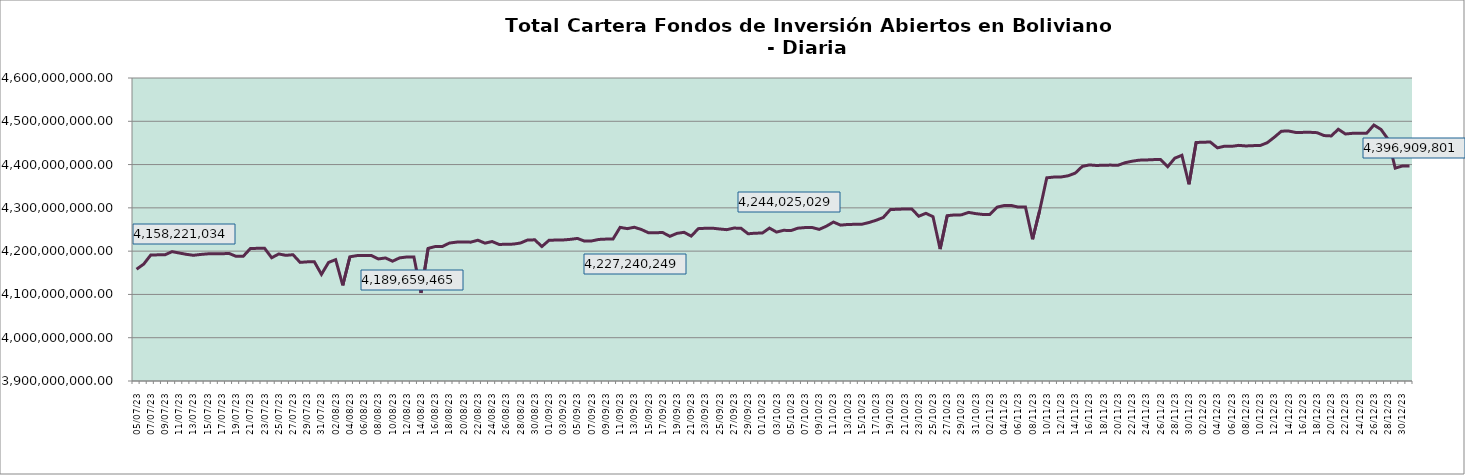
| Category | Cartera |
|---|---|
| 2023-07-05 | 4158221034.08 |
| 2023-07-06 | 4169974810.54 |
| 2023-07-07 | 4191063550.36 |
| 2023-07-08 | 4191428935.51 |
| 2023-07-09 | 4191586921.83 |
| 2023-07-10 | 4198901340.23 |
| 2023-07-11 | 4195687107.59 |
| 2023-07-12 | 4192644613.16 |
| 2023-07-13 | 4190400136.23 |
| 2023-07-14 | 4192336177.83 |
| 2023-07-15 | 4193705226.34 |
| 2023-07-16 | 4193877594.42 |
| 2023-07-17 | 4193884394.17 |
| 2023-07-18 | 4194821268.79 |
| 2023-07-19 | 4187948287.11 |
| 2023-07-20 | 4188026936.86 |
| 2023-07-21 | 4205930925.8 |
| 2023-07-22 | 4206534537.64 |
| 2023-07-23 | 4206693945.34 |
| 2023-07-24 | 4184753822.47 |
| 2023-07-25 | 4193497085.57 |
| 2023-07-26 | 4190287751.32 |
| 2023-07-27 | 4191772840.51 |
| 2023-07-28 | 4174048482 |
| 2023-07-29 | 4175243410.97 |
| 2023-07-30 | 4175403616.42 |
| 2023-07-31 | 4146339606.57 |
| 2023-08-01 | 4173947669.8 |
| 2023-08-02 | 4180302429.91 |
| 2023-08-03 | 4120964301.83 |
| 2023-08-04 | 4186896892.98 |
| 2023-08-05 | 4189659464.87 |
| 2023-08-06 | 4189829925.45 |
| 2023-08-07 | 4189997926.39 |
| 2023-08-08 | 4182013840.75 |
| 2023-08-09 | 4184244274.94 |
| 2023-08-10 | 4176804528.9 |
| 2023-08-11 | 4184479961.39 |
| 2023-08-12 | 4186483542.9 |
| 2023-08-13 | 4186665210.29 |
| 2023-08-14 | 4103514129.2 |
| 2023-08-15 | 4206353895.49 |
| 2023-08-16 | 4210672529.8 |
| 2023-08-17 | 4210754155.33 |
| 2023-08-18 | 4218713701.53 |
| 2023-08-19 | 4220833367.62 |
| 2023-08-20 | 4221001552.47 |
| 2023-08-21 | 4220802613.47 |
| 2023-08-22 | 4225243261.51 |
| 2023-08-23 | 4218450717.82 |
| 2023-08-24 | 4222200191.94 |
| 2023-08-25 | 4215374375.49 |
| 2023-08-26 | 4216013726.39 |
| 2023-08-27 | 4216249329.15 |
| 2023-08-28 | 4218832957.71 |
| 2023-08-29 | 4225826732.84 |
| 2023-08-30 | 4226083207.61 |
| 2023-08-31 | 4210660955.15 |
| 2023-09-01 | 4225037532.44 |
| 2023-09-02 | 4225665290.26 |
| 2023-09-03 | 4225837782.96 |
| 2023-09-04 | 4227240249.25 |
| 2023-09-05 | 4229369887.25 |
| 2023-09-06 | 4223134189.63 |
| 2023-09-07 | 4223572973.05 |
| 2023-09-08 | 4227031396.42 |
| 2023-09-09 | 4227828115.47 |
| 2023-09-10 | 4227998265.07 |
| 2023-09-11 | 4254934059.22 |
| 2023-09-12 | 4251997659.89 |
| 2023-09-13 | 4255168121.96 |
| 2023-09-14 | 4249945741.98 |
| 2023-09-15 | 4242376110.43 |
| 2023-09-16 | 4242697978.39 |
| 2023-09-17 | 4242873084.15 |
| 2023-09-18 | 4234198831.63 |
| 2023-09-19 | 4241122644.1 |
| 2023-09-20 | 4243478115.99 |
| 2023-09-21 | 4234723410.56 |
| 2023-09-22 | 4251990813.6 |
| 2023-09-23 | 4252824802.38 |
| 2023-09-24 | 4253001324.64 |
| 2023-09-25 | 4251195146.31 |
| 2023-09-26 | 4249614122.72 |
| 2023-09-27 | 4253275776.12 |
| 2023-09-28 | 4252923490.36 |
| 2023-09-29 | 4240084259.46 |
| 2023-09-30 | 4241550326.26 |
| 2023-10-01 | 4241740015.55 |
| 2023-10-02 | 4253251683.8 |
| 2023-10-03 | 4244025028.9 |
| 2023-10-04 | 4248160567.43 |
| 2023-10-05 | 4247416448.27 |
| 2023-10-06 | 4253046297.14 |
| 2023-10-07 | 4254432875.57 |
| 2023-10-08 | 4254607816.99 |
| 2023-10-09 | 4250276298.22 |
| 2023-10-10 | 4257566355.66 |
| 2023-10-11 | 4267208349.57 |
| 2023-10-12 | 4260077291.27 |
| 2023-10-13 | 4261575395.82 |
| 2023-10-14 | 4261984257.98 |
| 2023-10-15 | 4262148121.72 |
| 2023-10-16 | 4266161012.53 |
| 2023-10-17 | 4271338439.98 |
| 2023-10-18 | 4277700920.1 |
| 2023-10-19 | 4295989286.49 |
| 2023-10-20 | 4296752483 |
| 2023-10-21 | 4297352768.14 |
| 2023-10-22 | 4297515758.63 |
| 2023-10-23 | 4280664793.45 |
| 2023-10-24 | 4287408973.45 |
| 2023-10-25 | 4279614406.75 |
| 2023-10-26 | 4204785195.17 |
| 2023-10-27 | 4281961612.99 |
| 2023-10-28 | 4283622242.24 |
| 2023-10-29 | 4283803811.07 |
| 2023-10-30 | 4289506540.61 |
| 2023-10-31 | 4286689692.19 |
| 2023-11-01 | 4284761280.38 |
| 2023-11-02 | 4284889038.22 |
| 2023-11-03 | 4301594212.59 |
| 2023-11-04 | 4305374107 |
| 2023-11-05 | 4305557747.44 |
| 2023-11-06 | 4301691364.38 |
| 2023-11-07 | 4301975072.92 |
| 2023-11-08 | 4227421817.51 |
| 2023-11-09 | 4293799971.52 |
| 2023-11-10 | 4369428468.75 |
| 2023-11-11 | 4371160358 |
| 2023-11-12 | 4371321552.44 |
| 2023-11-13 | 4374036488.01 |
| 2023-11-14 | 4380249168.59 |
| 2023-11-15 | 4395825155.76 |
| 2023-11-16 | 4399190209.36 |
| 2023-11-17 | 4397887887.33 |
| 2023-11-18 | 4398579844.36 |
| 2023-11-19 | 4398759308.67 |
| 2023-11-20 | 4398296510.09 |
| 2023-11-21 | 4404236003.53 |
| 2023-11-22 | 4407786452.76 |
| 2023-11-23 | 4410199675.83 |
| 2023-11-24 | 4410645721.9 |
| 2023-11-25 | 4411427855.31 |
| 2023-11-26 | 4411608567.59 |
| 2023-11-27 | 4395009258.51 |
| 2023-11-28 | 4414758140.09 |
| 2023-11-29 | 4421448911.02 |
| 2023-11-30 | 4354375325.07 |
| 2023-12-01 | 4450921375.8 |
| 2023-12-02 | 4451765891.18 |
| 2023-12-03 | 4451960745.03 |
| 2023-12-04 | 4438628762.86 |
| 2023-12-05 | 4442441869.92 |
| 2023-12-06 | 4442103984.82 |
| 2023-12-07 | 4444373478.95 |
| 2023-12-08 | 4442992657.54 |
| 2023-12-09 | 4443749468.74 |
| 2023-12-10 | 4443952228.26 |
| 2023-12-11 | 4450460471.99 |
| 2023-12-12 | 4463148794.27 |
| 2023-12-13 | 4477168995.04 |
| 2023-12-14 | 4477485456.63 |
| 2023-12-15 | 4474197441.85 |
| 2023-12-16 | 4474368223.63 |
| 2023-12-17 | 4474578959.2 |
| 2023-12-18 | 4473710709.35 |
| 2023-12-19 | 4466995308.19 |
| 2023-12-20 | 4466150193.08 |
| 2023-12-21 | 4481596686.48 |
| 2023-12-22 | 4470675674.26 |
| 2023-12-23 | 4472212249.11 |
| 2023-12-24 | 4472423094.28 |
| 2023-12-25 | 4472637527.95 |
| 2023-12-26 | 4491312389.91 |
| 2023-12-27 | 4481184198.47 |
| 2023-12-28 | 4458449001.93 |
| 2023-12-29 | 4391809437.69 |
| 2023-12-30 | 4396686145.28 |
| 2023-12-31 | 4396909800.84 |